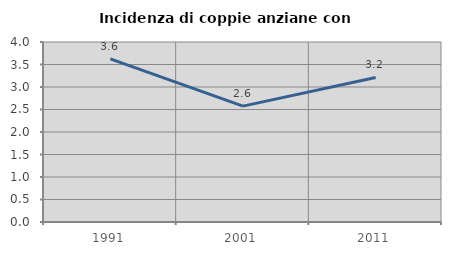
| Category | Incidenza di coppie anziane con figli |
|---|---|
| 1991.0 | 3.625 |
| 2001.0 | 2.574 |
| 2011.0 | 3.212 |